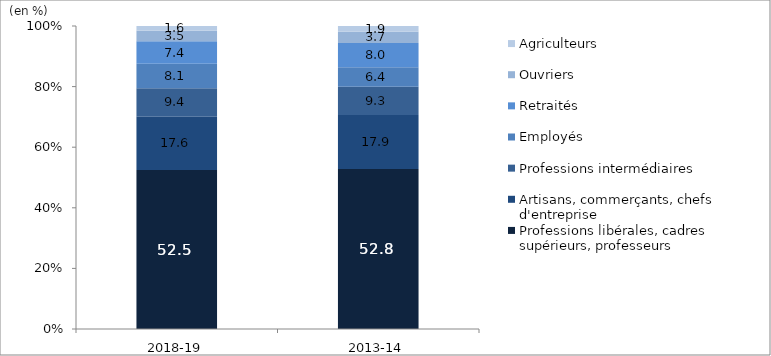
| Category | Professions libérales, cadres supérieurs, professeurs | Artisans, commerçants, chefs d'entreprise | Professions intermédiaires | Employés | Retraités | Ouvriers | Agriculteurs |
|---|---|---|---|---|---|---|---|
| 2018-19 | 52.46 | 17.628 | 9.381 | 8.095 | 7.369 | 3.481 | 1.587 |
| 2013-14 | 52.782 | 17.878 | 9.266 | 6.444 | 8.032 | 3.701 | 1.896 |